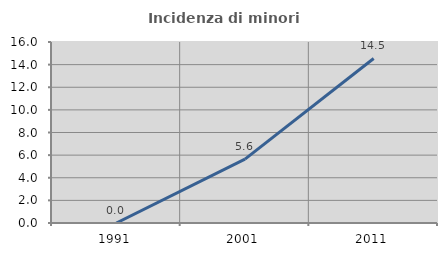
| Category | Incidenza di minori stranieri |
|---|---|
| 1991.0 | 0 |
| 2001.0 | 5.645 |
| 2011.0 | 14.545 |